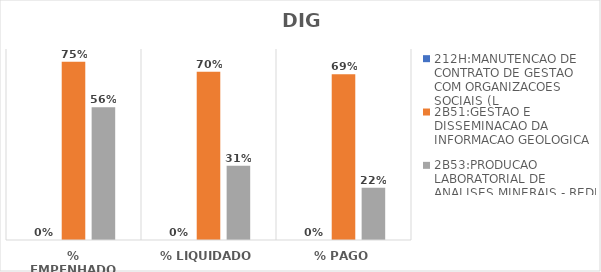
| Category | 212H:MANUTENCAO DE CONTRATO DE GESTAO COM ORGANIZACOES SOCIAIS (L | 2B51:GESTAO E DISSEMINACAO DA INFORMACAO GEOLOGICA | 2B53:PRODUCAO LABORATORIAL DE ANALISES MINERAIS - REDE LAMIN |
|---|---|---|---|
| % EMPENHADO | 0 | 0.746 | 0.556 |
| % LIQUIDADO | 0 | 0.705 | 0.311 |
| % PAGO | 0 | 0.694 | 0.219 |